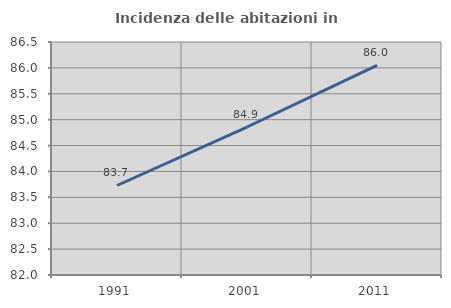
| Category | Incidenza delle abitazioni in proprietà  |
|---|---|
| 1991.0 | 83.729 |
| 2001.0 | 84.858 |
| 2011.0 | 86.047 |